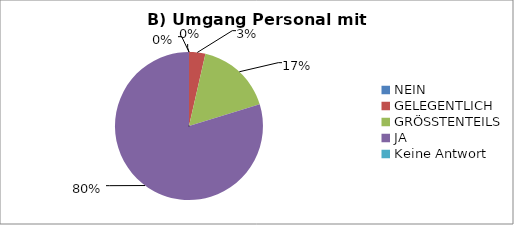
| Category | Series 0 |
|---|---|
| NEIN | 0 |
| GELEGENTLICH | 3 |
| GRÖSSTENTEILS | 14 |
| JA | 67 |
| Keine Antwort | 0 |